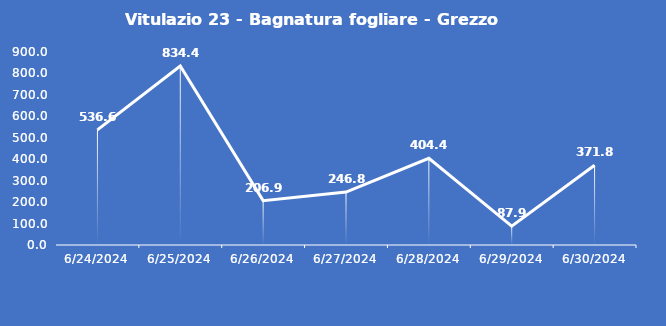
| Category | Vitulazio 23 - Bagnatura fogliare - Grezzo (min) |
|---|---|
| 6/24/24 | 536.6 |
| 6/25/24 | 834.4 |
| 6/26/24 | 206.9 |
| 6/27/24 | 246.8 |
| 6/28/24 | 404.4 |
| 6/29/24 | 87.9 |
| 6/30/24 | 371.8 |